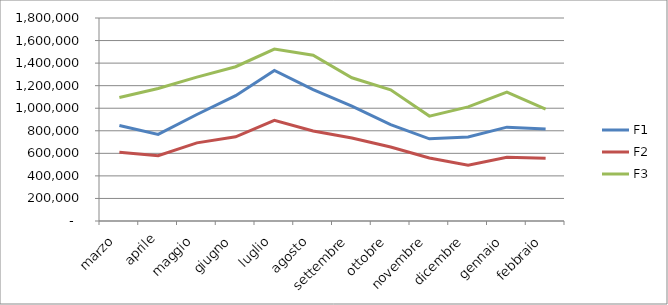
| Category |  F1  |  F2  |  F3  |
|---|---|---|---|
|  marzo  | 846693 | 609132 | 1094476 |
|  aprile  | 768010 | 579455 | 1175347 |
|  maggio  | 944187 | 692660 | 1275574 |
|  giugno  | 1110817 | 746419 | 1368028 |
|  luglio  | 1335478 | 892489 | 1524553 |
|  agosto  | 1165014 | 797731 | 1469913 |
|  settembre  | 1018079 | 736032 | 1269726 |
|  ottobre  | 854015 | 655697 | 1162919 |
|  novembre  | 728617 | 558913 | 930158 |
|  dicembre  | 744738 | 495496 | 1011830 |
|  gennaio  | 831991 | 565638 | 1143432 |
|  febbraio  | 815138 | 556778 | 992493 |